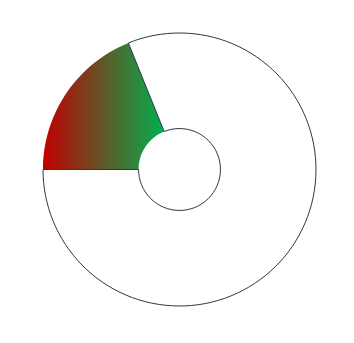
| Category | Series 0 |
|---|---|
| 0 | 68 |
| 1 | 292 |